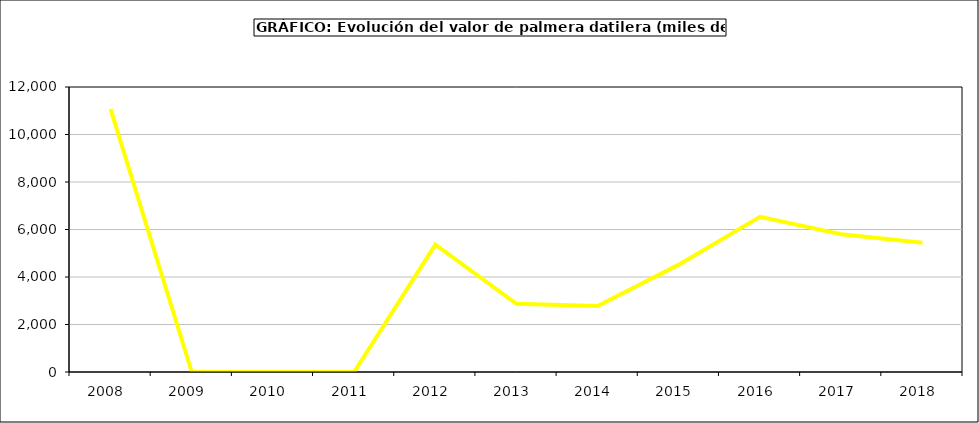
| Category | valor kiwi |
|---|---|
| 2008.0 | 11066.726 |
| 2009.0 | 0 |
| 2010.0 | 0 |
| 2011.0 | 0 |
| 2012.0 | 5362.2 |
| 2013.0 | 2872 |
| 2014.0 | 2781 |
| 2015.0 | 4520 |
| 2016.0 | 6537 |
| 2017.0 | 5802.72 |
| 2018.0 | 5438.16 |